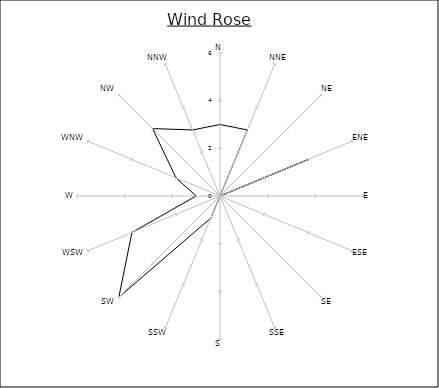
| Category | Series 0 |
|---|---|
| N | 3 |
| NNE | 3 |
| NE | 0 |
| ENE | 4 |
| E | 0 |
| ESE | 0 |
| SE | 0 |
| SSE | 0 |
| S | 0 |
| SSW | 1 |
| SW | 6 |
| WSW | 4 |
| W | 1 |
| WNW | 2 |
| NW | 4 |
| NNW | 3 |